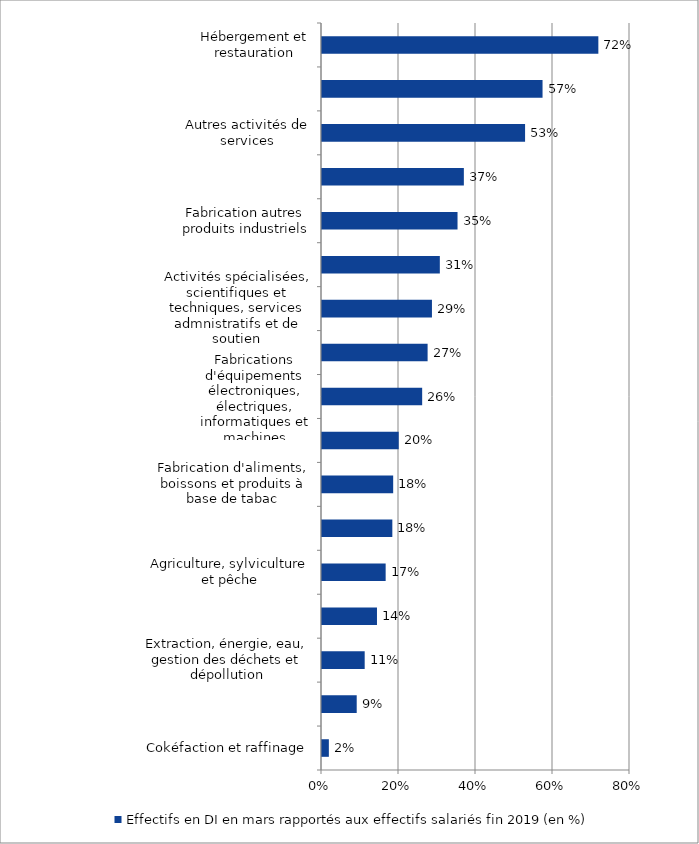
| Category | Effectifs en DI en mars rapportés aux effectifs salariés fin 2019 (en %) |
|---|---|
| Cokéfaction et raffinage | 0.018 |
| Activités financières et d'assurance | 0.09 |
| Extraction, énergie, eau, gestion des déchets et dépollution | 0.111 |
| Information et communication | 0.143 |
| Agriculture, sylviculture et pêche | 0.165 |
| Administration publique, enseignement, santé et action sociale | 0.183 |
| Fabrication d'aliments, boissons et produits à base de tabac | 0.185 |
| Transports et entreposage | 0.199 |
| Fabrications d'équipements électroniques, électriques, informatiques et machines | 0.26 |
| Activités immobilières | 0.274 |
| Activités spécialisées, scientifiques et techniques, services admnistratifs et de soutien | 0.286 |
| Fabrication de matériels de transport | 0.306 |
| Fabrication autres produits industriels | 0.352 |
| Commerce | 0.368 |
| Autres activités de services | 0.527 |
| Construction | 0.573 |
| Hébergement et restauration | 0.718 |